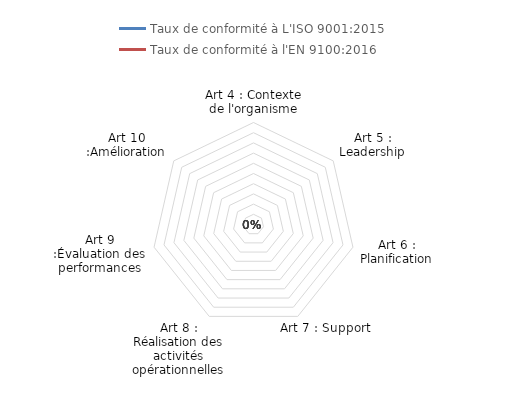
| Category | Taux de conformité à L'ISO 9001:2015 | Taux de conformité à l'EN 9100:2016 |
|---|---|---|
| Art 4 : Contexte de l'organisme | 0 | 0 |
| Art 5 : Leadership | 0 | 0 |
| Art 6 : Planification | 0 | 0 |
| Art 7 : Support | 0 | 0 |
| Art 8 : Réalisation des activités opérationnelles | 0 | 0 |
| Art 9 :Évaluation des performances | 0 | 0 |
| Art 10 :Amélioration | 0 | 0 |